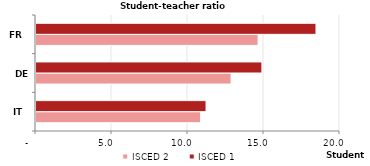
| Category | ISCED 2 | ISCED 1 |
|---|---|---|
| IT | 10.83 | 11.187 |
| DE | 12.834 | 14.863 |
| FR | 14.609 | 18.42 |